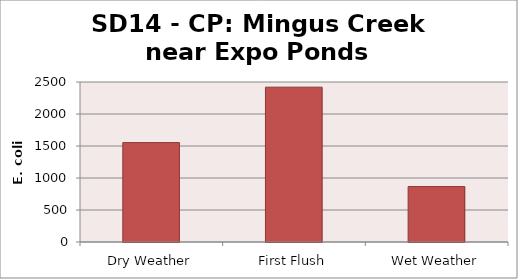
| Category | E. coli MPN |
|---|---|
| Dry Weather | 1553.1 |
| First Flush | 2419.2 |
| Wet Weather | 866.4 |